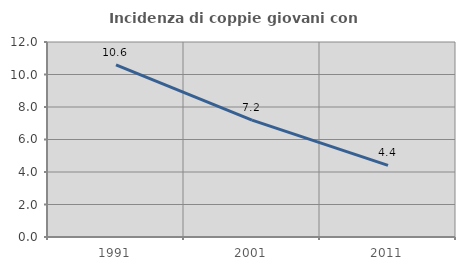
| Category | Incidenza di coppie giovani con figli |
|---|---|
| 1991.0 | 10.598 |
| 2001.0 | 7.193 |
| 2011.0 | 4.404 |